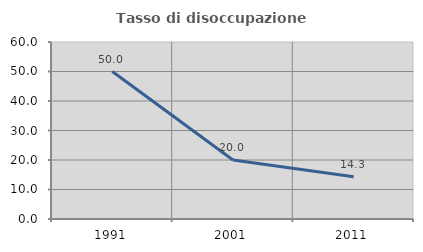
| Category | Tasso di disoccupazione giovanile  |
|---|---|
| 1991.0 | 50 |
| 2001.0 | 20 |
| 2011.0 | 14.286 |